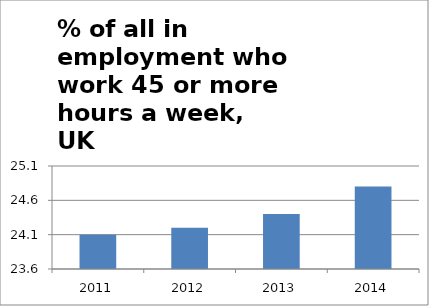
| Category | % of all in employment who work 45 hours or more |
|---|---|
| 2011.0 | 24.1 |
| 2012.0 | 24.2 |
| 2013.0 | 24.4 |
| 2014.0 | 24.8 |